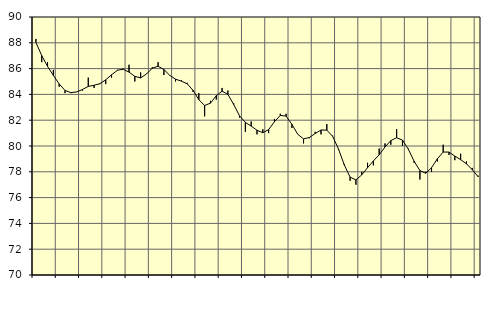
| Category | Piggar | Series 1 |
|---|---|---|
| nan | 88.3 | 88.03 |
| 1.0 | 86.5 | 87.01 |
| 1.0 | 86.5 | 86.17 |
| 1.0 | 85.9 | 85.47 |
| nan | 84.6 | 84.81 |
| 2.0 | 84.1 | 84.31 |
| 2.0 | 84.1 | 84.14 |
| 2.0 | 84.2 | 84.19 |
| nan | 84.3 | 84.38 |
| 3.0 | 85.3 | 84.62 |
| 3.0 | 84.5 | 84.71 |
| 3.0 | 84.8 | 84.83 |
| nan | 84.8 | 85.13 |
| 4.0 | 85.3 | 85.52 |
| 4.0 | 85.9 | 85.87 |
| 4.0 | 86 | 85.95 |
| nan | 86.3 | 85.73 |
| 5.0 | 85 | 85.4 |
| 5.0 | 85.7 | 85.28 |
| 5.0 | 85.6 | 85.58 |
| nan | 86.1 | 86.03 |
| 6.0 | 86.5 | 86.18 |
| 6.0 | 85.5 | 85.93 |
| 6.0 | 85.5 | 85.48 |
| nan | 85 | 85.18 |
| 7.0 | 85.1 | 85.03 |
| 7.0 | 84.9 | 84.82 |
| 7.0 | 84.2 | 84.32 |
| nan | 84.1 | 83.59 |
| 8.0 | 82.3 | 83.14 |
| 8.0 | 83.5 | 83.32 |
| 8.0 | 83.6 | 83.9 |
| nan | 84.5 | 84.25 |
| 9.0 | 84.3 | 84 |
| 9.0 | 83.3 | 83.21 |
| 9.0 | 82.2 | 82.34 |
| nan | 81.1 | 81.83 |
| 10.0 | 81.9 | 81.54 |
| 10.0 | 80.9 | 81.22 |
| 10.0 | 81.3 | 81.03 |
| nan | 81 | 81.27 |
| 11.0 | 82.1 | 81.88 |
| 11.0 | 82.5 | 82.37 |
| 11.0 | 82.5 | 82.32 |
| nan | 81.4 | 81.68 |
| 12.0 | 80.9 | 80.91 |
| 12.0 | 80.2 | 80.55 |
| 12.0 | 80.6 | 80.66 |
| nan | 81.1 | 80.97 |
| 13.0 | 80.9 | 81.24 |
| 13.0 | 81.7 | 81.23 |
| 13.0 | 80.8 | 80.75 |
| nan | 79.7 | 79.77 |
| 14.0 | 78.6 | 78.54 |
| 14.0 | 77.3 | 77.59 |
| 14.0 | 77 | 77.37 |
| nan | 78 | 77.76 |
| 15.0 | 78.7 | 78.32 |
| 15.0 | 78.5 | 78.84 |
| 15.0 | 79.8 | 79.32 |
| nan | 80.2 | 79.92 |
| 16.0 | 80.1 | 80.42 |
| 16.0 | 81.3 | 80.64 |
| 16.0 | 80 | 80.46 |
| nan | 79.8 | 79.76 |
| 17.0 | 78.7 | 78.82 |
| 17.0 | 77.4 | 78.09 |
| 17.0 | 78 | 77.89 |
| nan | 78 | 78.32 |
| 18.0 | 78.8 | 79.01 |
| 18.0 | 80.1 | 79.53 |
| 18.0 | 79.3 | 79.53 |
| nan | 78.9 | 79.22 |
| 19.0 | 79.4 | 78.94 |
| 19.0 | 78.8 | 78.62 |
| 19.0 | 78.3 | 78.16 |
| nan | 77.7 | 77.62 |